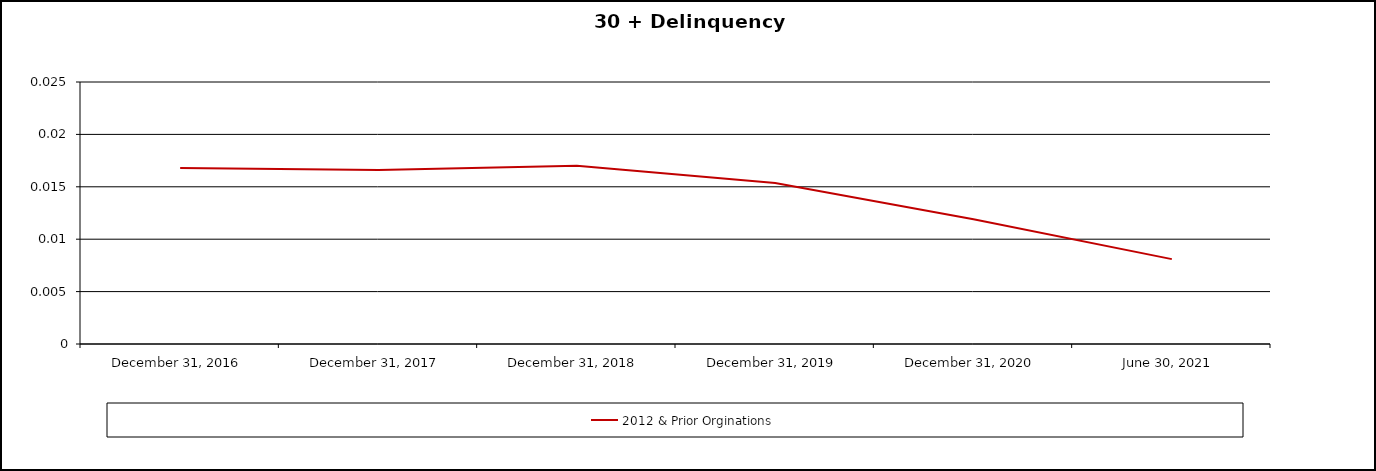
| Category | 2012 & Prior Orginations  |
|---|---|
| 2016-12-31 | 0.017 |
| 2017-12-31 | 0.017 |
| 2018-12-31 | 0.017 |
| 2019-12-31 | 0.015 |
| 2020-12-31 | 0.012 |
| 2021-06-30 | 0.008 |